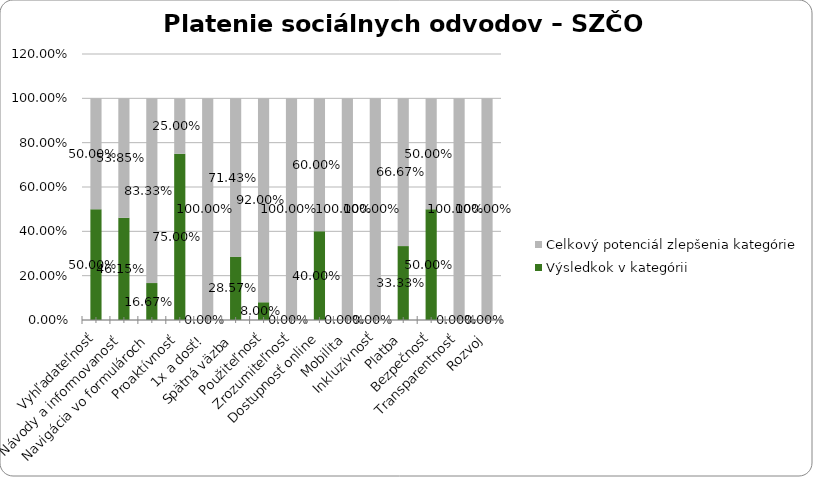
| Category | Výsledkok v kategórii | Celkový potenciál zlepšenia kategórie |
|---|---|---|
| Vyhľadateľnosť | 0.5 | 0.5 |
| Návody a informovanosť | 0.462 | 0.538 |
| Navigácia vo formulároch | 0.167 | 0.833 |
| Proaktívnosť | 0.75 | 0.25 |
| 1x a dosť! | 0 | 1 |
| Spätná väzba | 0.286 | 0.714 |
| Použiteľnosť | 0.08 | 0.92 |
| Zrozumiteľnosť | 0 | 1 |
| Dostupnosť online | 0.4 | 0.6 |
| Mobilita | 0 | 1 |
| Inkluzívnosť | 0 | 1 |
| Platba | 0.333 | 0.667 |
| Bezpečnosť | 0.5 | 0.5 |
| Transparentnosť | 0 | 1 |
| Rozvoj | 0 | 1 |